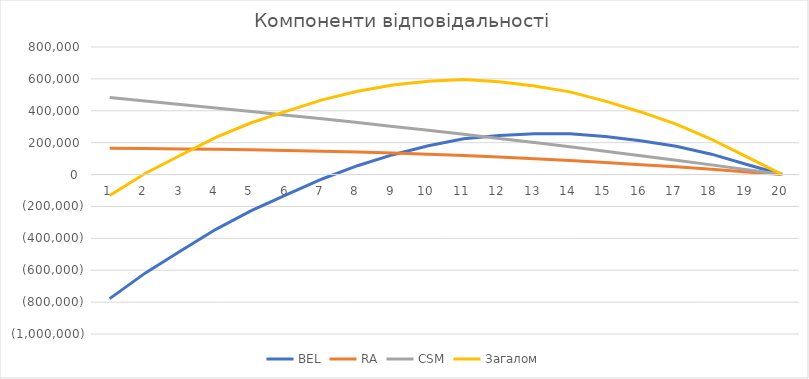
| Category | BEL | RA | CSM | Загалом |
|---|---|---|---|---|
| 0 | -778304.079 | 164524.13 | 482587.412 | -131192.537 |
| 1 | -618300.754 | 163508.295 | 461328.328 | 6535.869 |
| 2 | -479565.328 | 161031.225 | 439722.506 | 121188.404 |
| 3 | -343535.591 | 158910.451 | 417753.989 | 233128.849 |
| 4 | -226162.17 | 155511.3 | 395401.991 | 324751.121 |
| 5 | -126164.785 | 150926.159 | 372649.033 | 397410.407 |
| 6 | -27696.029 | 146705.456 | 349476.863 | 468486.29 |
| 7 | 55552.275 | 141444.895 | 325862.465 | 522859.636 |
| 8 | 124640.923 | 135218.824 | 301785.891 | 561645.638 |
| 9 | 180557.412 | 128095.38 | 277226.322 | 585879.114 |
| 10 | 224220.031 | 120136.834 | 252162.039 | 596518.904 |
| 11 | 245196.413 | 110271.39 | 226570.384 | 582038.188 |
| 12 | 255689.478 | 99693.309 | 200431.438 | 555814.225 |
| 13 | 256410.971 | 88446.928 | 173720.608 | 518578.507 |
| 14 | 238384.811 | 75608.641 | 146412.259 | 460405.711 |
| 15 | 211964.806 | 62189.97 | 118483.228 | 392638.004 |
| 16 | 177688.675 | 48220.118 | 89905.708 | 315814.501 |
| 17 | 127835.932 | 32903.161 | 60650.724 | 221389.817 |
| 18 | 63387.894 | 16315.147 | 30691.502 | 110394.544 |
| 19 | 0 | 0 | 0 | 0 |